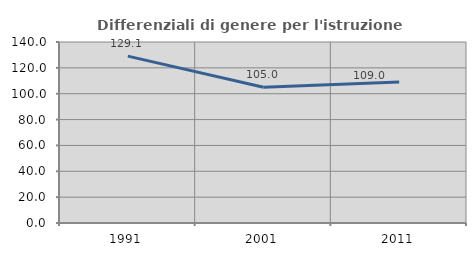
| Category | Differenziali di genere per l'istruzione superiore |
|---|---|
| 1991.0 | 129.077 |
| 2001.0 | 105.005 |
| 2011.0 | 109.001 |